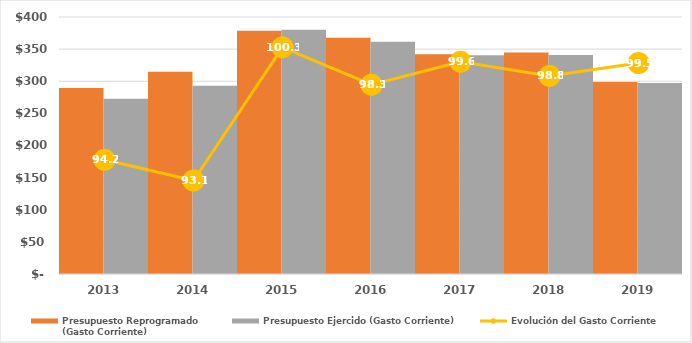
| Category | Presupuesto Reprogramado
(Gasto Corriente) | Presupuesto Ejercido (Gasto Corriente) |
|---|---|---|
| 2013.0 | 289428.733 | 272702.822 |
| 2014.0 | 314864.8 | 293113.7 |
| 2015.0 | 378700.3 | 380021.6 |
| 2016.0 | 367600.7 | 361385.3 |
| 2017.0 | 341839.2 | 340334.7 |
| 2018.0 | 344938.7 | 340765 |
| 2019.0 | 298904.428 | 297383.7 |